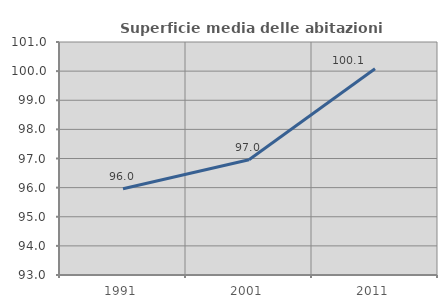
| Category | Superficie media delle abitazioni occupate |
|---|---|
| 1991.0 | 95.964 |
| 2001.0 | 96.955 |
| 2011.0 | 100.08 |